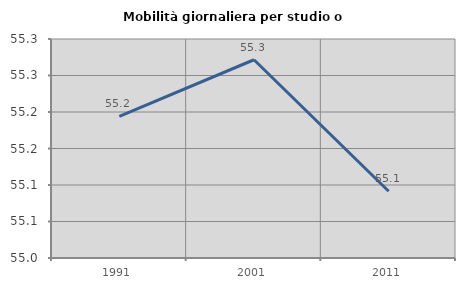
| Category | Mobilità giornaliera per studio o lavoro |
|---|---|
| 1991.0 | 55.194 |
| 2001.0 | 55.272 |
| 2011.0 | 55.091 |